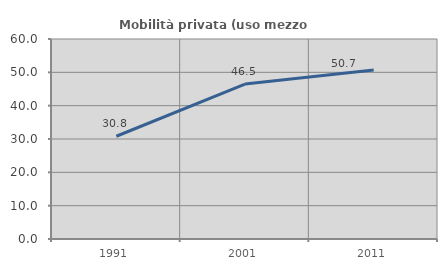
| Category | Mobilità privata (uso mezzo privato) |
|---|---|
| 1991.0 | 30.826 |
| 2001.0 | 46.479 |
| 2011.0 | 50.676 |